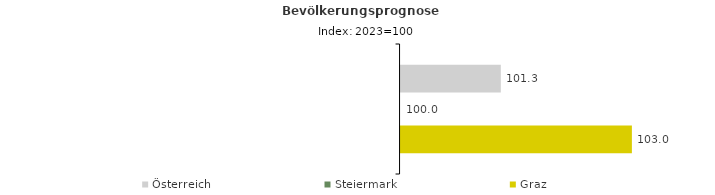
| Category | Österreich | Steiermark | Graz |
|---|---|---|---|
| 2023.0 | 101.3 | 100 | 103 |